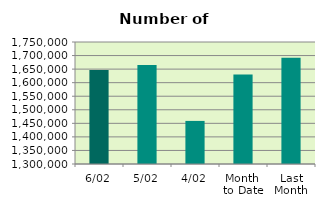
| Category | Series 0 |
|---|---|
| 6/02 | 1646826 |
| 5/02 | 1665336 |
| 4/02 | 1458924 |
| Month 
to Date | 1630359.5 |
| Last
Month | 1692009 |